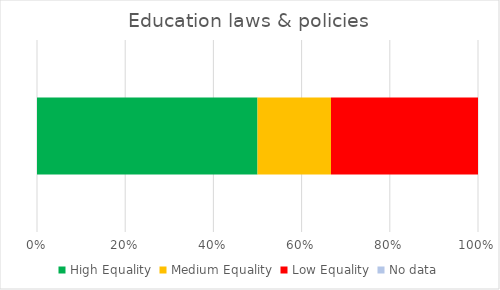
| Category | High Equality | Medium Equality | Low Equality | No data |
|---|---|---|---|---|
| 0 | 3 | 1 | 2 | 0 |